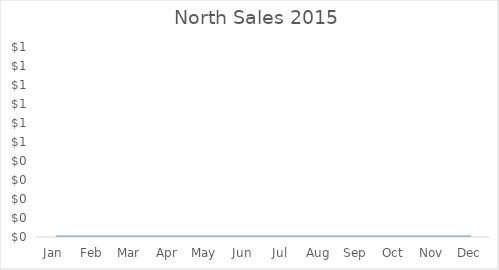
| Category | Series 0 |
|---|---|
| Jan | 13927 |
| Feb | 11646 |
| Mar | 13931 |
| Apr | 13790 |
| May | 14808 |
| Jun | 13717 |
| Jul | 10953 |
| Aug | 12105 |
| Sep | 14956 |
| Oct | 10046 |
| Nov | 10151 |
| Dec | 12546 |